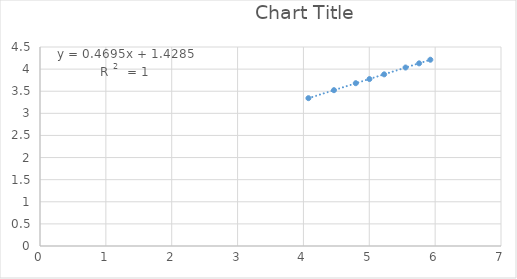
| Category | Series 0 |
|---|---|
| 4.075841090657541 | 3.343 |
| 4.463606621666305 | 3.523 |
| 4.794963757620747 | 3.681 |
| 5.002603122398992 | 3.775 |
| 5.225746673713202 | 3.882 |
| 5.5506312951620265 | 4.036 |
| 5.756691130311603 | 4.13 |
| 5.9274592171320695 | 4.212 |